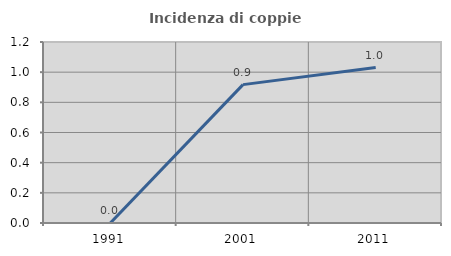
| Category | Incidenza di coppie miste |
|---|---|
| 1991.0 | 0 |
| 2001.0 | 0.917 |
| 2011.0 | 1.031 |